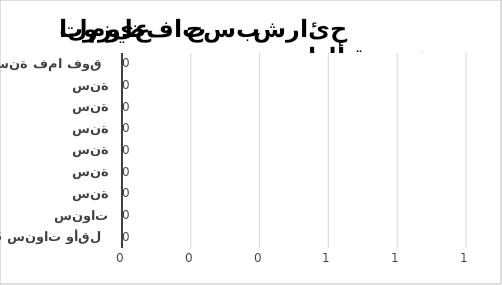
| Category | Series 1 |
|---|---|
| 5 سنوات وأقل | 0 |
| ما بين 6 و10 سنوات | 0 |
| ما بين 11 و 15 سنة | 0 |
| ما بين 16 و20 سنة | 0 |
| ما بين 21 و25 سنة | 0 |
| ما بين 26 و30 سنة | 0 |
| ما بين 31 و35 سنة | 0 |
| ما بين 36 و40 سنة | 0 |
| 41 سنة فما فوق | 0 |